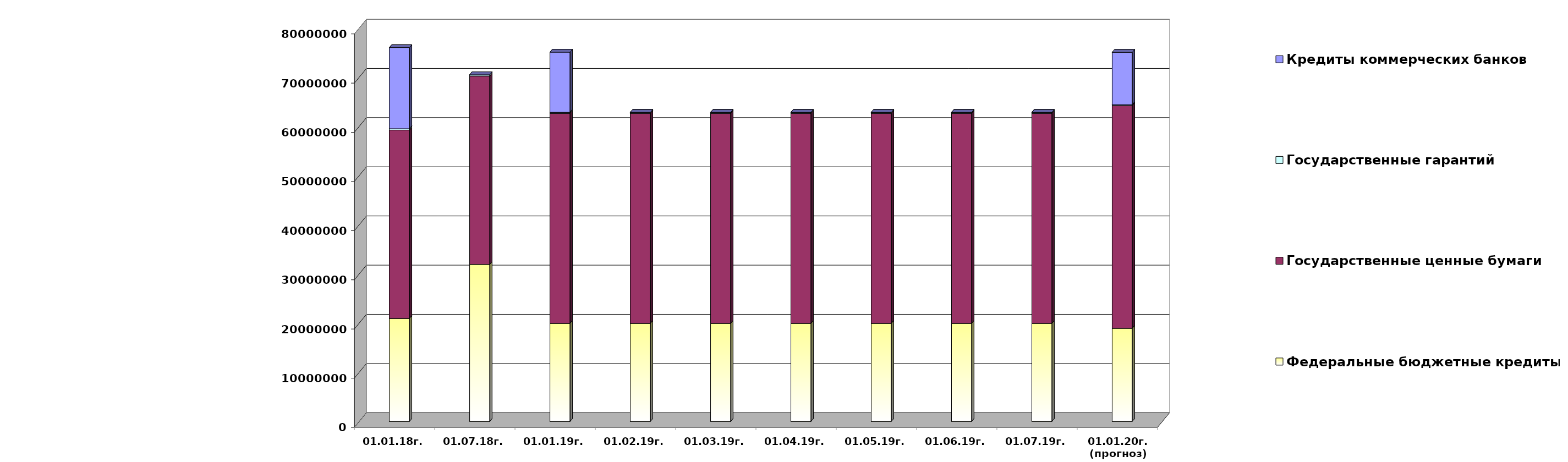
| Category | Федеральные бюджетные кредиты | Государственные ценные бумаги  | Государственные гарантий | Кредиты коммерческих банков |
|---|---|---|---|---|
| 01.01.18г. | 20959084.963 | 38300000 | 267412.82 | 16500000 |
| 01.07.18г. | 31945227.963 | 38300000 | 253223.16 | 0 |
| 01.01.19г. | 19957026.213 | 42700000 | 209872.86 | 12219963.75 |
| 01.02.19г. | 19957026.213 | 42700000 | 200735.86 | 0 |
| 01.03.19г. | 19957026.213 | 42700000 | 200735.86 | 0 |
| 01.04.19г. | 19957026.213 | 42700000 | 200735.86 | 0 |
| 01.05.19г. | 19957026.213 | 42700000 | 200735.86 | 0 |
| 01.06.19г. | 19957026.213 | 42700000 | 200735.86 | 0 |
| 01.07.19г. | 19957026.213 | 42700000 | 200735.86 | 0 |
| 01.01.20г.
(прогноз) | 18954967.4 | 45300000 | 155130 | 10650535.9 |